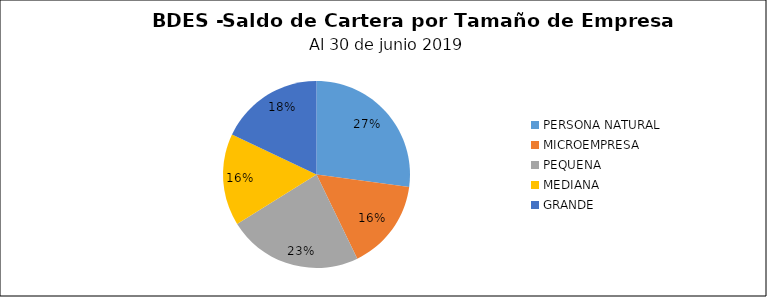
| Category | Saldo | Créditos |
|---|---|---|
| PERSONA NATURAL | 108.099 | 8650 |
| MICROEMPRESA | 62.533 | 7077 |
| PEQUENA | 92.987 | 2356 |
| MEDIANA | 63.37 | 499 |
| GRANDE | 71.572 | 187 |